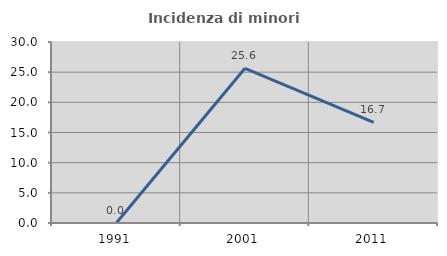
| Category | Incidenza di minori stranieri |
|---|---|
| 1991.0 | 0 |
| 2001.0 | 25.641 |
| 2011.0 | 16.667 |